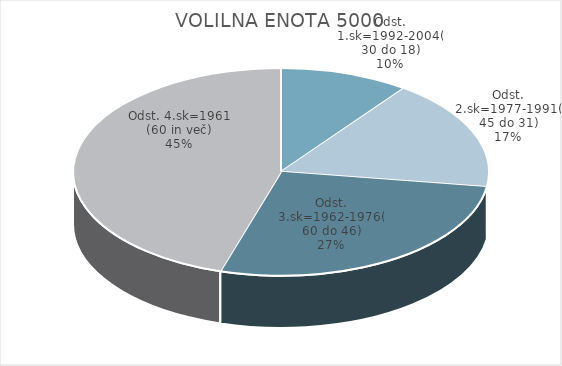
| Category | VOLILNA ENOTA 5000 |
|---|---|
| Odst. 1.sk=1992-2004(30 do 18) | 4.07 |
| Odst. 2.sk=1977-1991(45 do 31) | 6.97 |
| Odst. 3.sk=1962-1976(60 do 46) | 11.05 |
| Odst. 4.sk=1961 (60 in več) | 18.29 |